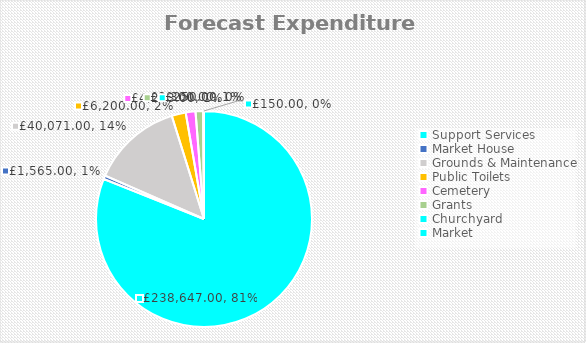
| Category | Series 1 |
|---|---|
| Support Services | 238647 |
| Market House | 1565 |
| Grounds & Maintenance | 40071 |
| Public Toilets | 6200 |
| Cemetery | 4293 |
| Grants | 3300 |
| Churchyard | 250 |
| Market   | 150 |